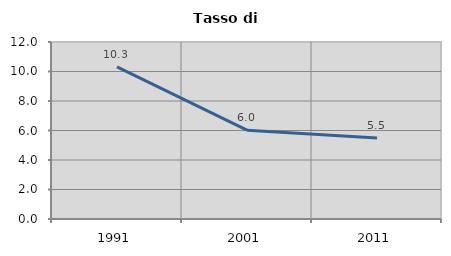
| Category | Tasso di disoccupazione   |
|---|---|
| 1991.0 | 10.309 |
| 2001.0 | 6.024 |
| 2011.0 | 5.495 |